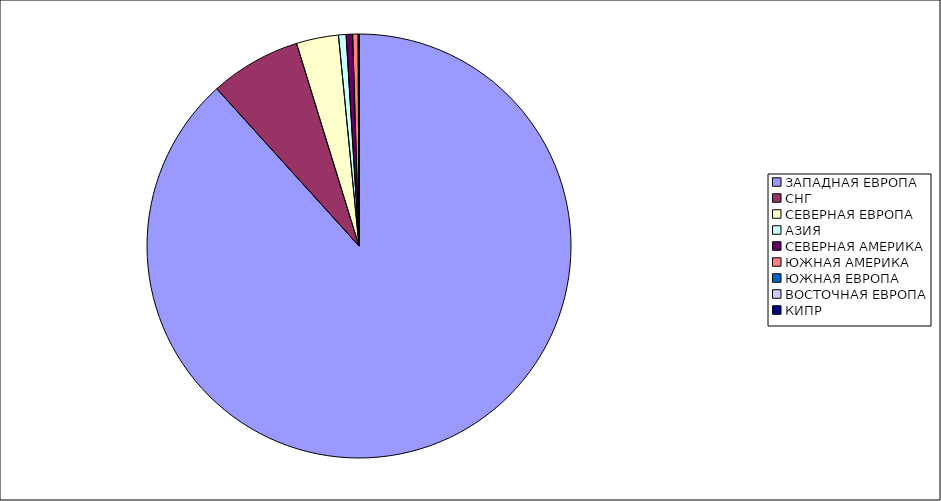
| Category | Оборот |
|---|---|
| ЗАПАДНАЯ ЕВРОПА | 0.883 |
| СНГ | 0.069 |
| СЕВЕРНАЯ ЕВРОПА | 0.032 |
| АЗИЯ | 0.006 |
| СЕВЕРНАЯ АМЕРИКА | 0.005 |
| ЮЖНАЯ АМЕРИКА | 0.004 |
| ЮЖНАЯ ЕВРОПА | 0.001 |
| ВОСТОЧНАЯ ЕВРОПА | 0 |
| КИПР | 0 |